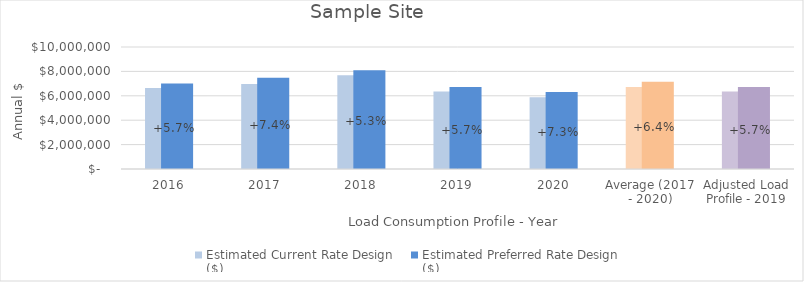
| Category | Estimated Current Rate Design
($) | Estimated Preferred Rate Design
($) |
|---|---|---|
| 2016 | 6635891.449 | 7016289.377 |
| 2017 | 6965784.733 | 7480936.733 |
| 2018 | 7674997.072 | 8085250.847 |
| 2019 | 6353886.616 | 6713092.843 |
| 2020 | 5883626.023 | 6314912.593 |
| Average (2017 - 2020) | 6719573.611 | 7148548.254 |
| Adjusted Load Profile - 2019 | 6353886.616 | 6713092.779 |